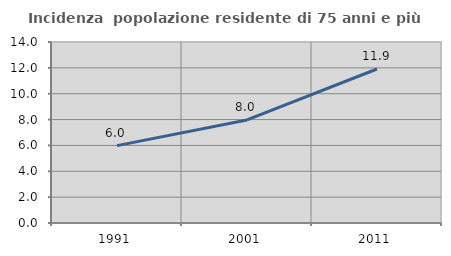
| Category | Incidenza  popolazione residente di 75 anni e più |
|---|---|
| 1991.0 | 5.984 |
| 2001.0 | 7.974 |
| 2011.0 | 11.91 |